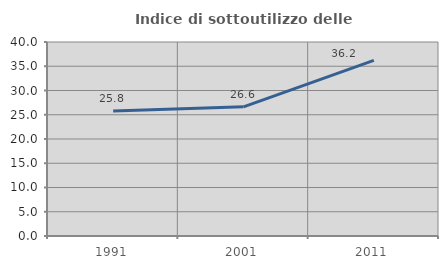
| Category | Indice di sottoutilizzo delle abitazioni  |
|---|---|
| 1991.0 | 25.757 |
| 2001.0 | 26.64 |
| 2011.0 | 36.204 |